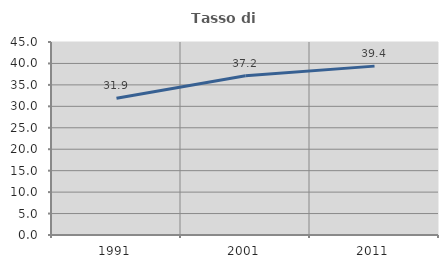
| Category | Tasso di occupazione   |
|---|---|
| 1991.0 | 31.894 |
| 2001.0 | 37.154 |
| 2011.0 | 39.376 |